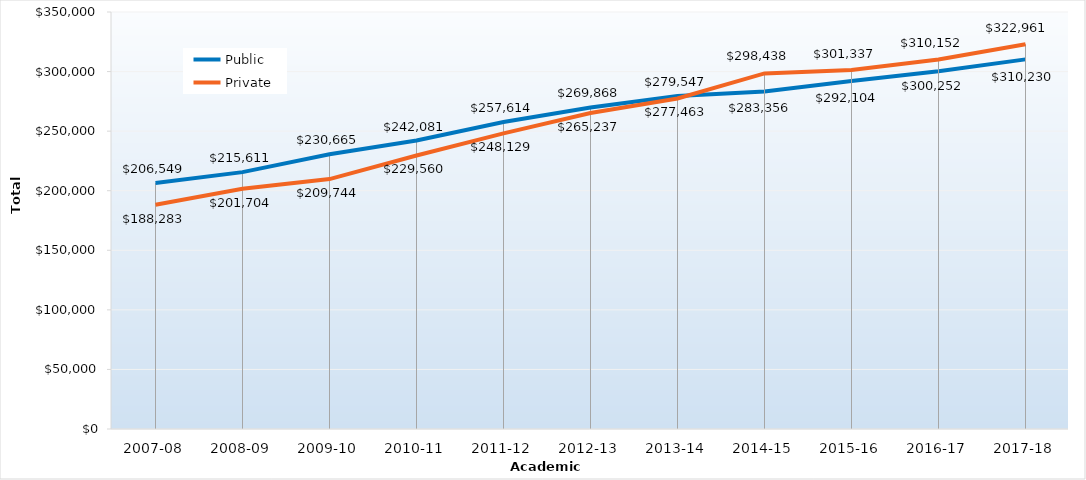
| Category | Public | Private |
|---|---|---|
| 2007-08 | 206549 | 188283 |
| 2008-09 | 215611 | 201704 |
| 2009-10 | 230665 | 209744 |
| 2010-11 | 242081 | 229560 |
| 2011-12 | 257614 | 248129 |
| 2012-13 | 269868 | 265237 |
| 2013-14 | 279547 | 277463 |
| 2014-15 | 283356 | 298438 |
| 2015-16 | 292103.97 | 301337.21 |
| 2016-17 | 300252.49 | 310151.65 |
| 2017-18 | 310229.56 | 322960.58 |